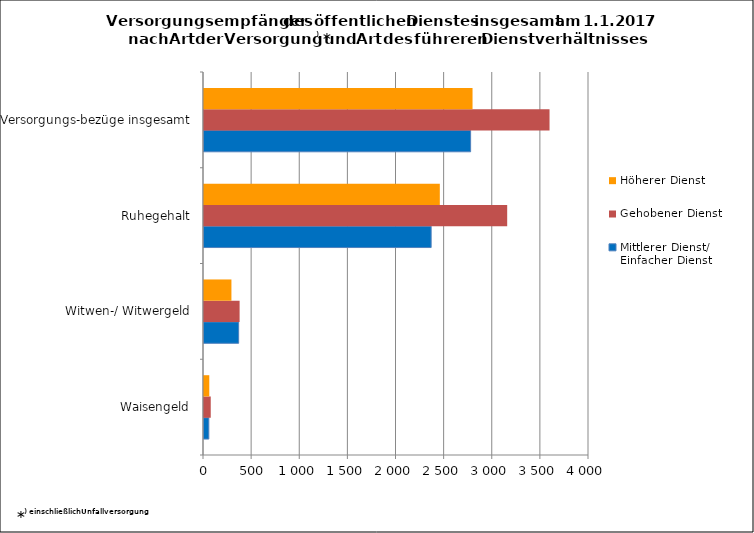
| Category | Mittlerer Dienst/ Einfacher Dienst | Gehobener Dienst | Höherer Dienst |
|---|---|---|---|
| Waisengeld | 50 | 70 | 55 |
| Witwen-/ Witwergeld | 360 | 370 | 285 |
| Ruhegehalt | 2360 | 3150 | 2450 |
| Versorgungs-bezüge insgesamt | 2770 | 3590 | 2790 |